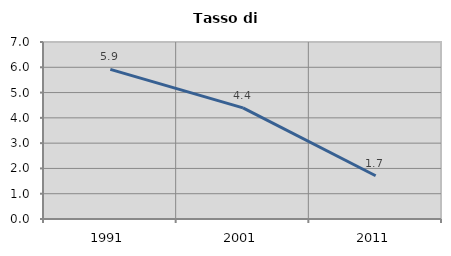
| Category | Tasso di disoccupazione   |
|---|---|
| 1991.0 | 5.919 |
| 2001.0 | 4.396 |
| 2011.0 | 1.709 |